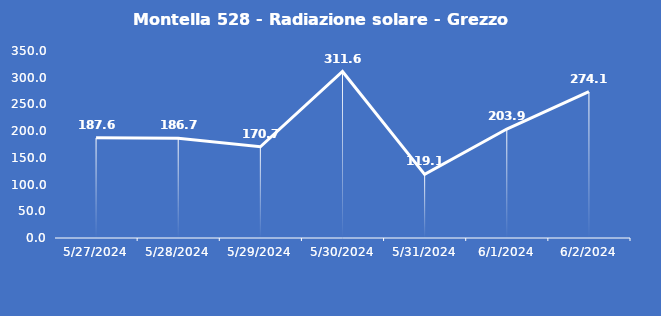
| Category | Montella 528 - Radiazione solare - Grezzo (W/m2) |
|---|---|
| 5/27/24 | 187.6 |
| 5/28/24 | 186.7 |
| 5/29/24 | 170.7 |
| 5/30/24 | 311.6 |
| 5/31/24 | 119.1 |
| 6/1/24 | 203.9 |
| 6/2/24 | 274.1 |